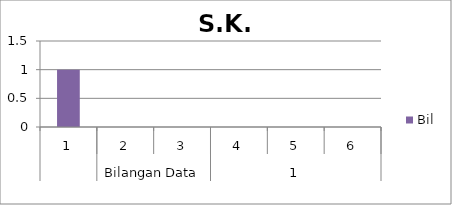
| Category | Bil |
|---|---|
| 0 | 1 |
| 1 | 0 |
| 2 | 0 |
| 3 | 0 |
| 4 | 0 |
| 5 | 0 |